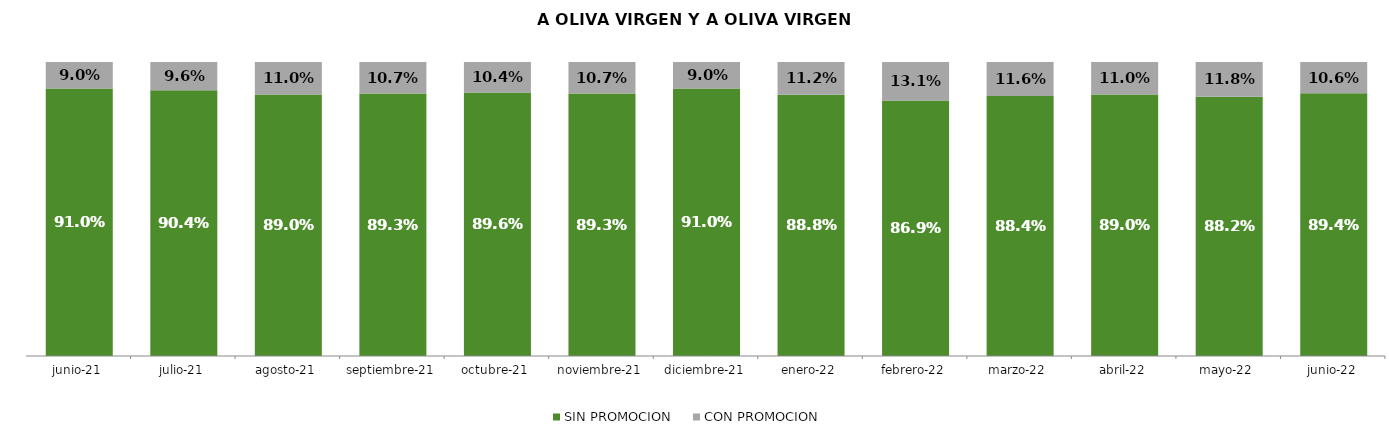
| Category | SIN PROMOCION   | CON PROMOCION   |
|---|---|---|
| 2021-06-01 | 0.91 | 0.09 |
| 2021-07-01 | 0.904 | 0.096 |
| 2021-08-01 | 0.89 | 0.11 |
| 2021-09-01 | 0.893 | 0.107 |
| 2021-10-01 | 0.896 | 0.104 |
| 2021-11-01 | 0.893 | 0.107 |
| 2021-12-01 | 0.91 | 0.09 |
| 2022-01-01 | 0.888 | 0.112 |
| 2022-02-01 | 0.869 | 0.131 |
| 2022-03-01 | 0.884 | 0.116 |
| 2022-04-01 | 0.89 | 0.11 |
| 2022-05-01 | 0.882 | 0.118 |
| 2022-06-01 | 0.894 | 0.106 |